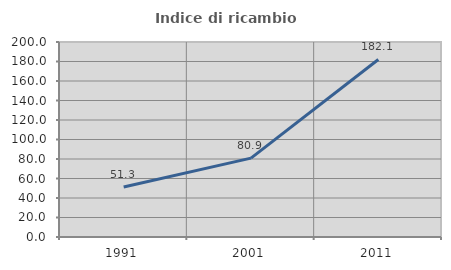
| Category | Indice di ricambio occupazionale  |
|---|---|
| 1991.0 | 51.253 |
| 2001.0 | 80.891 |
| 2011.0 | 182.092 |